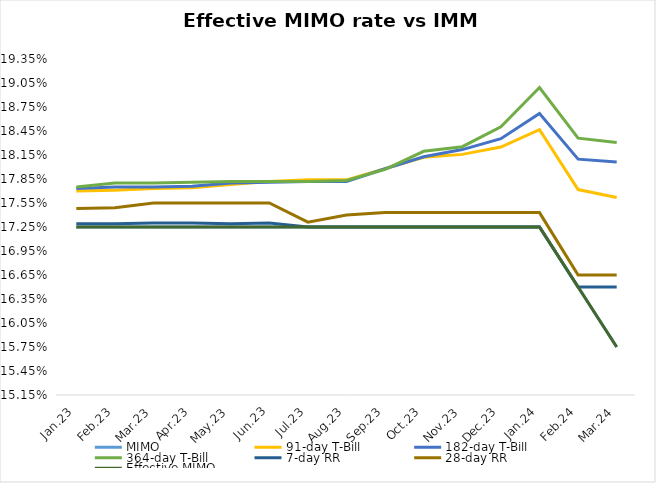
| Category | MIMO | 91-day T-Bill | 182-day T-Bill | 364-day T-Bill | 7-day RR | 28-day RR | Effective MIMO |
|---|---|---|---|---|---|---|---|
| Jan.23 | 0.172 | 0.177 | 0.177 | 0.178 | 0.173 | 0.175 | 0.172 |
| Feb.23 | 0.172 | 0.177 | 0.178 | 0.178 | 0.173 | 0.175 | 0.172 |
| Mar.23 | 0.172 | 0.177 | 0.178 | 0.178 | 0.173 | 0.176 | 0.172 |
| Apr.23 | 0.172 | 0.177 | 0.178 | 0.178 | 0.173 | 0.176 | 0.172 |
| May.23 | 0.172 | 0.178 | 0.178 | 0.178 | 0.173 | 0.176 | 0.172 |
| Jun.23 | 0.172 | 0.178 | 0.178 | 0.178 | 0.173 | 0.176 | 0.172 |
| Jul.23 | 0.172 | 0.178 | 0.178 | 0.178 | 0.172 | 0.173 | 0.172 |
| Aug.23 | 0.172 | 0.178 | 0.178 | 0.178 | 0.172 | 0.174 | 0.172 |
| Sep.23 | 0.172 | 0.18 | 0.18 | 0.18 | 0.172 | 0.174 | 0.172 |
| Oct.23 | 0.172 | 0.181 | 0.181 | 0.182 | 0.172 | 0.174 | 0.172 |
| Nov.23 | 0.172 | 0.182 | 0.182 | 0.183 | 0.172 | 0.174 | 0.172 |
| Dec.23 | 0.172 | 0.182 | 0.184 | 0.185 | 0.172 | 0.174 | 0.172 |
| Jan.24 | 0.172 | 0.185 | 0.187 | 0.19 | 0.172 | 0.174 | 0.172 |
| Feb.24 | 0.165 | 0.177 | 0.181 | 0.184 | 0.165 | 0.166 | 0.165 |
| Mar.24 | 0.158 | 0.176 | 0.181 | 0.183 | 0.165 | 0.166 | 0.158 |